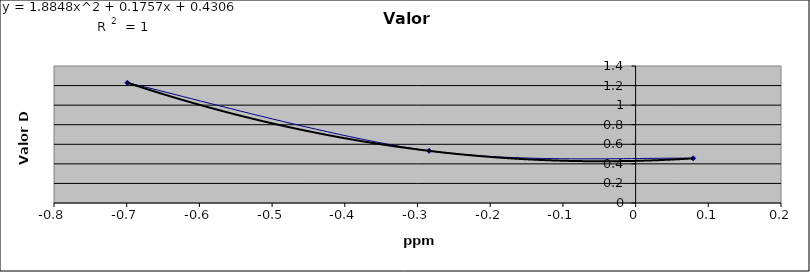
| Category | Series 0 |
|---|---|
| 0.0791812460476248 | 0.456 |
| -0.2839966563652008 | 0.533 |
| -0.6989700043360187 | 1.229 |